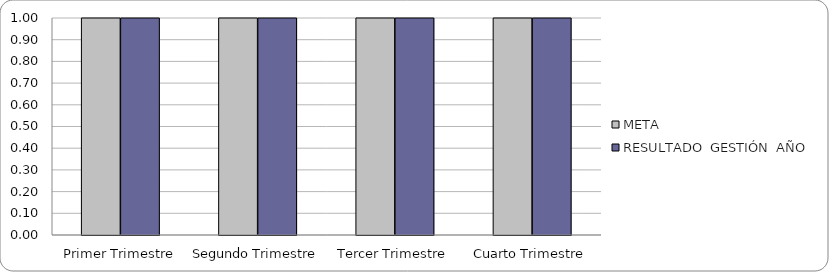
| Category | META | RESULTADO  GESTIÓN  AÑO |
|---|---|---|
| Primer Trimestre | 100 | 1 |
| Segundo Trimestre | 100 | 1 |
| Tercer Trimestre | 100 | 1 |
| Cuarto Trimestre | 100 | 1 |